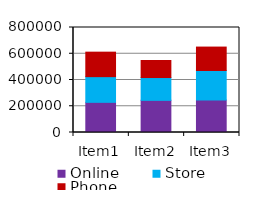
| Category | Online | Store | Phone |
|---|---|---|---|
| Item1 | 229880 | 195635 | 186630 |
| Item2 | 244885 | 173885 | 129833 |
| Item3 | 247609 | 224595 | 178649 |